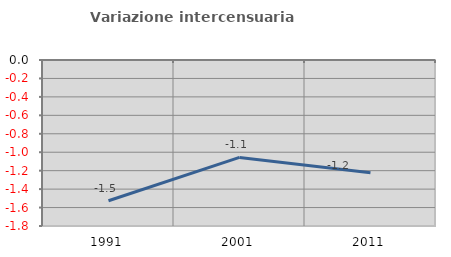
| Category | Variazione intercensuaria annua |
|---|---|
| 1991.0 | -1.526 |
| 2001.0 | -1.056 |
| 2011.0 | -1.223 |